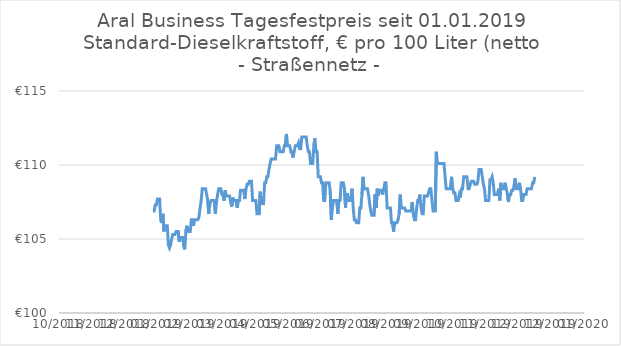
| Category | Series 0 |
|---|---|
| 43815.0 | 109.2 |
| 43814.0 | 108.8 |
| 43813.0 | 108.8 |
| 43812.0 | 108.4 |
| 43811.0 | 108.4 |
| 43810.0 | 108.4 |
| 43809.0 | 108.4 |
| 43808.0 | 108.4 |
| 43807.0 | 108 |
| 43806.0 | 108 |
| 43805.0 | 108 |
| 43804.0 | 107.6 |
| 43803.0 | 107.6 |
| 43802.0 | 108.4 |
| 43801.0 | 108.8 |
| 43800.0 | 108.4 |
| 43799.0 | 108.4 |
| 43798.0 | 108.4 |
| 43797.0 | 109.1 |
| 43796.0 | 108.5 |
| 43795.0 | 108.3 |
| 43794.0 | 108.3 |
| 43793.0 | 108 |
| 43792.0 | 108 |
| 43791.0 | 107.5 |
| 43790.0 | 108 |
| 43789.0 | 108.4 |
| 43788.0 | 108.8 |
| 43787.0 | 108.4 |
| 43786.0 | 108.4 |
| 43785.0 | 108.4 |
| 43784.0 | 108.8 |
| 43783.0 | 107.6 |
| 43782.0 | 108.4 |
| 43781.0 | 108 |
| 43780.0 | 108 |
| 43779.0 | 108 |
| 43778.0 | 108 |
| 43777.0 | 108.8 |
| 43776.0 | 109.2 |
| 43775.0 | 109 |
| 43774.0 | 109 |
| 43773.0 | 107.6 |
| 43772.0 | 107.6 |
| 43771.0 | 107.6 |
| 43770.0 | 107.6 |
| 43769.0 | 108.4 |
| 43768.0 | 108.7 |
| 43767.0 | 109.2 |
| 43766.0 | 109.7 |
| 43765.0 | 109.7 |
| 43764.0 | 109.7 |
| 43763.0 | 108.9 |
| 43762.0 | 108.7 |
| 43761.0 | 108.7 |
| 43760.0 | 108.7 |
| 43759.0 | 108.9 |
| 43758.0 | 108.9 |
| 43757.0 | 108.9 |
| 43756.0 | 108.7 |
| 43755.0 | 108.4 |
| 43754.0 | 108.4 |
| 43753.0 | 109.2 |
| 43752.0 | 109.2 |
| 43751.0 | 109.2 |
| 43750.0 | 109.2 |
| 43749.0 | 108.4 |
| 43748.0 | 108.4 |
| 43747.0 | 107.8 |
| 43746.0 | 108 |
| 43745.0 | 107.6 |
| 43744.0 | 107.6 |
| 43743.0 | 107.6 |
| 43742.0 | 108.1 |
| 43741.0 | 108.1 |
| 43740.0 | 108.4 |
| 43739.0 | 109.2 |
| 43738.0 | 108.4 |
| 43737.0 | 108.4 |
| 43736.0 | 108.4 |
| 43735.0 | 108.4 |
| 43734.0 | 108.4 |
| 43733.0 | 109.2 |
| 43732.0 | 110.1 |
| 43731.0 | 110.1 |
| 43730.0 | 110.1 |
| 43729.0 | 110.1 |
| 43728.0 | 110.1 |
| 43727.0 | 110.1 |
| 43726.0 | 110.1 |
| 43725.0 | 110.9 |
| 43724.0 | 106.9 |
| 43723.0 | 106.9 |
| 43722.0 | 106.9 |
| 43721.0 | 107.6 |
| 43720.0 | 108.4 |
| 43719.0 | 108.4 |
| 43718.0 | 108.2 |
| 43717.0 | 107.9 |
| 43716.0 | 107.9 |
| 43715.0 | 107.9 |
| 43714.0 | 107.9 |
| 43713.0 | 106.7 |
| 43712.0 | 106.7 |
| 43711.0 | 107.1 |
| 43710.0 | 108 |
| 43709.0 | 107.6 |
| 43708.0 | 107.6 |
| 43707.0 | 107.1 |
| 43706.0 | 106.3 |
| 43705.0 | 106.3 |
| 43704.0 | 106.6 |
| 43703.0 | 107.5 |
| 43702.0 | 106.9 |
| 43701.0 | 106.9 |
| 43700.0 | 106.9 |
| 43699.0 | 106.9 |
| 43698.0 | 106.9 |
| 43697.0 | 106.9 |
| 43696.0 | 107.1 |
| 43695.0 | 107.1 |
| 43694.0 | 107.1 |
| 43693.0 | 107.1 |
| 43692.0 | 108 |
| 43691.0 | 106.7 |
| 43690.0 | 106.3 |
| 43689.0 | 106.1 |
| 43688.0 | 106.1 |
| 43687.0 | 106.1 |
| 43686.0 | 105.5 |
| 43685.0 | 106.1 |
| 43684.0 | 106.1 |
| 43683.0 | 107.1 |
| 43682.0 | 107.1 |
| 43681.0 | 107.1 |
| 43680.0 | 107.1 |
| 43679.0 | 108.8 |
| 43678.0 | 108.8 |
| 43677.0 | 108.4 |
| 43676.0 | 108 |
| 43675.0 | 108.3 |
| 43674.0 | 108.3 |
| 43673.0 | 108.3 |
| 43672.0 | 107.9 |
| 43671.0 | 108.4 |
| 43670.0 | 107.1 |
| 43669.0 | 108 |
| 43668.0 | 106.6 |
| 43667.0 | 106.6 |
| 43666.0 | 106.6 |
| 43665.0 | 106.9 |
| 43664.0 | 107.4 |
| 43663.0 | 108 |
| 43662.0 | 108.4 |
| 43661.0 | 108.4 |
| 43660.0 | 108.4 |
| 43659.0 | 108.4 |
| 43658.0 | 109.2 |
| 43657.0 | 108 |
| 43656.0 | 107.1 |
| 43655.0 | 107.1 |
| 43654.0 | 106.1 |
| 43653.0 | 106.1 |
| 43652.0 | 106.1 |
| 43651.0 | 106.3 |
| 43650.0 | 106.3 |
| 43649.0 | 107.1 |
| 43648.0 | 108.4 |
| 43647.0 | 107.6 |
| 43646.0 | 107.6 |
| 43645.0 | 107.6 |
| 43644.0 | 108 |
| 43643.0 | 108 |
| 43642.0 | 107.1 |
| 43641.0 | 108.4 |
| 43640.0 | 108.8 |
| 43639.0 | 108.8 |
| 43638.0 | 108.8 |
| 43637.0 | 107.6 |
| 43636.0 | 107.6 |
| 43635.0 | 106.7 |
| 43634.0 | 107.6 |
| 43633.0 | 107.6 |
| 43632.0 | 107.6 |
| 43631.0 | 107.6 |
| 43630.0 | 107.1 |
| 43629.0 | 106.3 |
| 43628.0 | 108.2 |
| 43627.0 | 108.8 |
| 43626.0 | 108.8 |
| 43625.0 | 108.8 |
| 43624.0 | 108.8 |
| 43623.0 | 107.6 |
| 43622.0 | 107.6 |
| 43621.0 | 108.8 |
| 43620.0 | 108.8 |
| 43619.0 | 109.2 |
| 43618.0 | 109.2 |
| 43617.0 | 109.2 |
| 43616.0 | 110.9 |
| 43615.0 | 110.9 |
| 43614.0 | 111.8 |
| 43613.0 | 111.3 |
| 43612.0 | 110.1 |
| 43611.0 | 110.1 |
| 43610.0 | 110.1 |
| 43609.0 | 110.9 |
| 43608.0 | 110.9 |
| 43607.0 | 111.3 |
| 43606.0 | 111.9 |
| 43605.0 | 111.9 |
| 43604.0 | 111.9 |
| 43603.0 | 111.9 |
| 43602.0 | 111.9 |
| 43601.0 | 111.1 |
| 43600.0 | 111.1 |
| 43599.0 | 111.5 |
| 43598.0 | 111.3 |
| 43597.0 | 111.3 |
| 43596.0 | 111.3 |
| 43595.0 | 110.9 |
| 43594.0 | 110.5 |
| 43593.0 | 110.9 |
| 43592.0 | 110.9 |
| 43591.0 | 111.3 |
| 43590.0 | 111.3 |
| 43589.0 | 111.3 |
| 43588.0 | 112.1 |
| 43587.0 | 111.3 |
| 43586.0 | 111.3 |
| 43585.0 | 110.9 |
| 43584.0 | 110.9 |
| 43583.0 | 110.9 |
| 43582.0 | 110.9 |
| 43581.0 | 111.3 |
| 43580.0 | 111.3 |
| 43579.0 | 111.3 |
| 43578.0 | 110.4 |
| 43577.0 | 110.4 |
| 43576.0 | 110.4 |
| 43575.0 | 110.4 |
| 43574.0 | 110.4 |
| 43573.0 | 110.1 |
| 43572.0 | 109.7 |
| 43571.0 | 109.2 |
| 43570.0 | 109.2 |
| 43569.0 | 108.8 |
| 43568.0 | 108.8 |
| 43567.0 | 107.4 |
| 43566.0 | 107.4 |
| 43565.0 | 107.4 |
| 43564.0 | 108.2 |
| 43563.0 | 106.7 |
| 43562.0 | 106.7 |
| 43561.0 | 106.7 |
| 43560.0 | 107.6 |
| 43559.0 | 107.6 |
| 43558.0 | 107.6 |
| 43557.0 | 107.6 |
| 43556.0 | 108.9 |
| 43555.0 | 108.9 |
| 43554.0 | 108.9 |
| 43553.0 | 108.7 |
| 43552.0 | 108.7 |
| 43551.0 | 108.4 |
| 43550.0 | 107.7 |
| 43549.0 | 108.3 |
| 43548.0 | 108.3 |
| 43547.0 | 108.3 |
| 43546.0 | 108.3 |
| 43545.0 | 107.6 |
| 43544.0 | 107.6 |
| 43543.0 | 107.1 |
| 43542.0 | 107.6 |
| 43541.0 | 107.6 |
| 43540.0 | 107.6 |
| 43539.0 | 107.8 |
| 43538.0 | 107.2 |
| 43537.0 | 107.5 |
| 43536.0 | 107.9 |
| 43535.0 | 107.9 |
| 43534.0 | 107.9 |
| 43533.0 | 107.9 |
| 43532.0 | 108.3 |
| 43531.0 | 107.6 |
| 43530.0 | 108 |
| 43529.0 | 108 |
| 43528.0 | 108.4 |
| 43527.0 | 108.4 |
| 43526.0 | 108.4 |
| 43525.0 | 108 |
| 43524.0 | 107.5 |
| 43523.0 | 106.7 |
| 43522.0 | 107.6 |
| 43521.0 | 107.6 |
| 43520.0 | 107.6 |
| 43519.0 | 107.6 |
| 43518.0 | 107.4 |
| 43517.0 | 106.7 |
| 43516.0 | 107.6 |
| 43515.0 | 108 |
| 43514.0 | 108.4 |
| 43513.0 | 108.4 |
| 43512.0 | 108.4 |
| 43511.0 | 108.4 |
| 43510.0 | 107.6 |
| 43509.0 | 107.1 |
| 43508.0 | 106.5 |
| 43507.0 | 106.3 |
| 43506.0 | 106.3 |
| 43505.0 | 106.3 |
| 43504.0 | 106.3 |
| 43503.0 | 105.9 |
| 43502.0 | 106.3 |
| 43501.0 | 106.3 |
| 43500.0 | 105.5 |
| 43499.0 | 105.5 |
| 43498.0 | 105.5 |
| 43497.0 | 105.9 |
| 43496.0 | 105.5 |
| 43495.0 | 104.3 |
| 43494.0 | 104.6 |
| 43493.0 | 105.1 |
| 43492.0 | 105.1 |
| 43491.0 | 105.1 |
| 43490.0 | 104.8 |
| 43489.0 | 105.5 |
| 43488.0 | 105.5 |
| 43487.0 | 105.5 |
| 43486.0 | 105.3 |
| 43485.0 | 105.3 |
| 43484.0 | 105.3 |
| 43483.0 | 105 |
| 43482.0 | 104.6 |
| 43481.0 | 104.4 |
| 43480.0 | 104.6 |
| 43479.0 | 105.9 |
| 43478.0 | 105.9 |
| 43477.0 | 105.9 |
| 43476.0 | 105.5 |
| 43475.0 | 106.7 |
| 43474.0 | 106.1 |
| 43473.0 | 106.3 |
| 43472.0 | 107.7 |
| 43471.0 | 107.7 |
| 43470.0 | 107.7 |
| 43469.0 | 107.3 |
| 43468.0 | 107.3 |
| 43467.0 | 106.9 |
| 43466.0 | 106.9 |